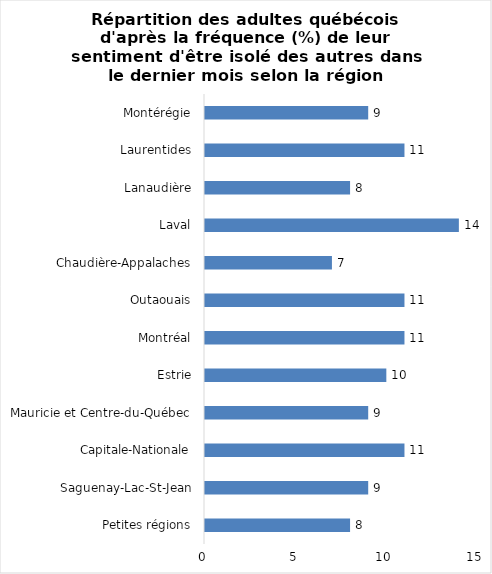
| Category | Series 0 |
|---|---|
| Petites régions | 8 |
| Saguenay-Lac-St-Jean | 9 |
| Capitale-Nationale | 11 |
| Mauricie et Centre-du-Québec | 9 |
| Estrie | 10 |
| Montréal | 11 |
| Outaouais | 11 |
| Chaudière-Appalaches | 7 |
| Laval | 14 |
| Lanaudière | 8 |
| Laurentides | 11 |
| Montérégie | 9 |